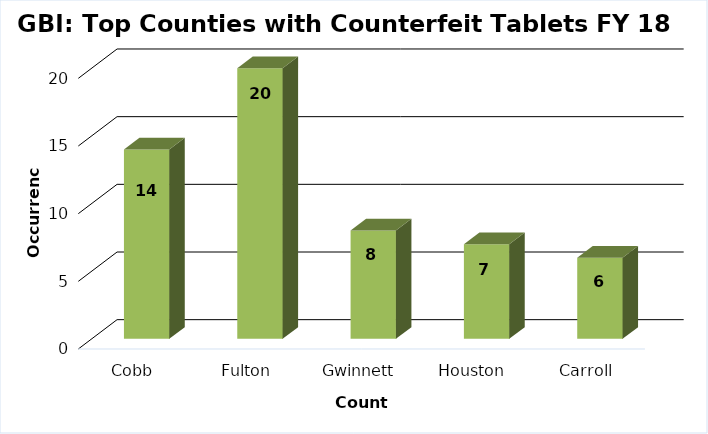
| Category | Series 0 |
|---|---|
| Cobb | 14 |
| Fulton | 20 |
| Gwinnett | 8 |
| Houston | 7 |
| Carroll | 6 |